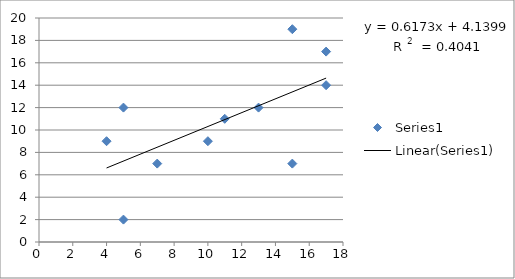
| Category | Series 0 |
|---|---|
| 4.0 | 9 |
| 5.0 | 12 |
| 5.0 | 2 |
| 7.0 | 7 |
| 10.0 | 9 |
| 11.0 | 11 |
| 13.0 | 12 |
| 15.0 | 7 |
| 15.0 | 19 |
| 17.0 | 14 |
| 17.0 | 17 |